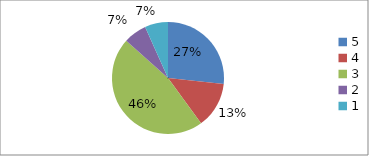
| Category | Series 0 | Series 1 |
|---|---|---|
| 5.0 | 26.7 | 26.7 |
| 4.0 | 13.3 | 13.3 |
| 3.0 | 46.7 | 46.7 |
| 2.0 | 6.7 | 6.7 |
| 1.0 | 6.7 | 6.7 |